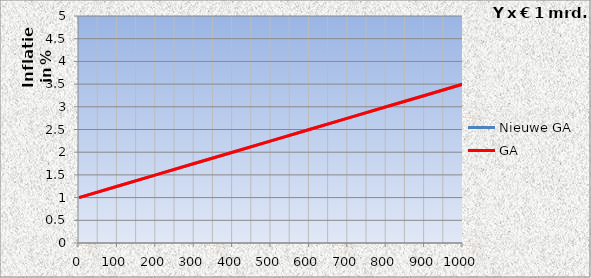
| Category | Nieuwe GA | GA |
|---|---|---|
| 0.0 | 1 | 1 |
| 100.0 | 1.25 | 1.25 |
| 200.0 | 1.5 | 1.5 |
| 300.0 | 1.75 | 1.75 |
| 400.0 | 2 | 2 |
| 500.0 | 2.25 | 2.25 |
| 600.0 | 2.5 | 2.5 |
| 700.0 | 2.75 | 2.75 |
| 800.0 | 3 | 3 |
| 900.0 | 3.25 | 3.25 |
| 1000.0 | 3.5 | 3.5 |